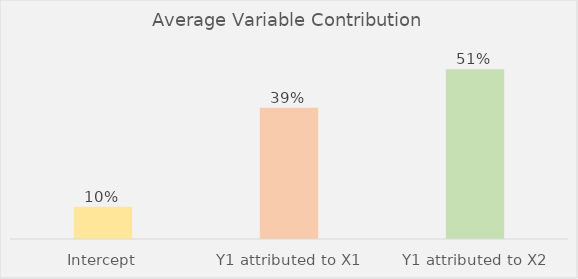
| Category | Series 0 |
|---|---|
| Intercept | 0.097 |
| Y1 attributed to X1 | 0.394 |
| Y1 attributed to X2 | 0.509 |